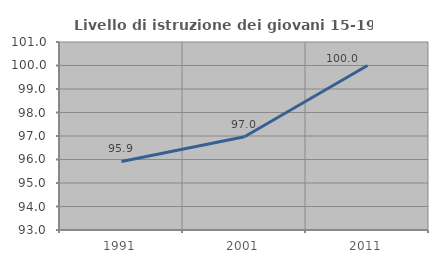
| Category | Livello di istruzione dei giovani 15-19 anni |
|---|---|
| 1991.0 | 95.918 |
| 2001.0 | 96.97 |
| 2011.0 | 100 |